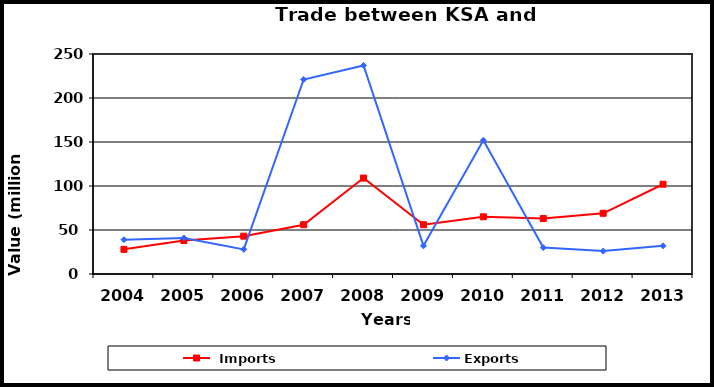
| Category |  Imports | Exports |
|---|---|---|
| 2004.0 | 28 | 39 |
| 2005.0 | 38 | 41 |
| 2006.0 | 43 | 28 |
| 2007.0 | 56 | 221 |
| 2008.0 | 109 | 237 |
| 2009.0 | 56 | 32 |
| 2010.0 | 65 | 152 |
| 2011.0 | 63 | 30 |
| 2012.0 | 69 | 26 |
| 2013.0 | 102 | 32 |